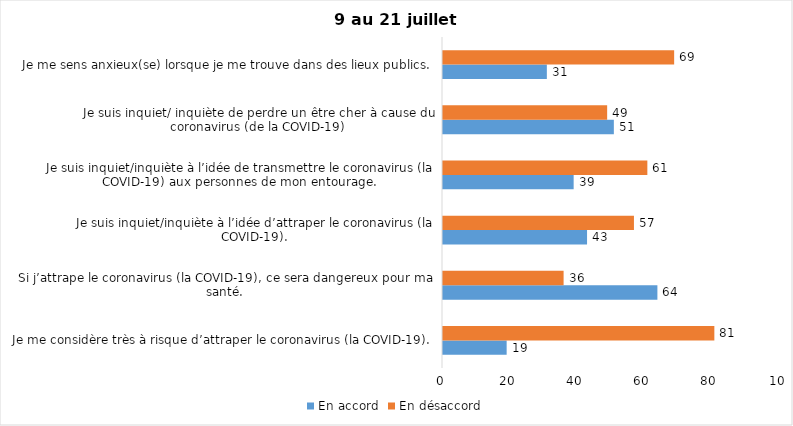
| Category | En accord | En désaccord |
|---|---|---|
| Je me considère très à risque d’attraper le coronavirus (la COVID-19). | 19 | 81 |
| Si j’attrape le coronavirus (la COVID-19), ce sera dangereux pour ma santé. | 64 | 36 |
| Je suis inquiet/inquiète à l’idée d’attraper le coronavirus (la COVID-19). | 43 | 57 |
| Je suis inquiet/inquiète à l’idée de transmettre le coronavirus (la COVID-19) aux personnes de mon entourage. | 39 | 61 |
| Je suis inquiet/ inquiète de perdre un être cher à cause du coronavirus (de la COVID-19) | 51 | 49 |
| Je me sens anxieux(se) lorsque je me trouve dans des lieux publics. | 31 | 69 |